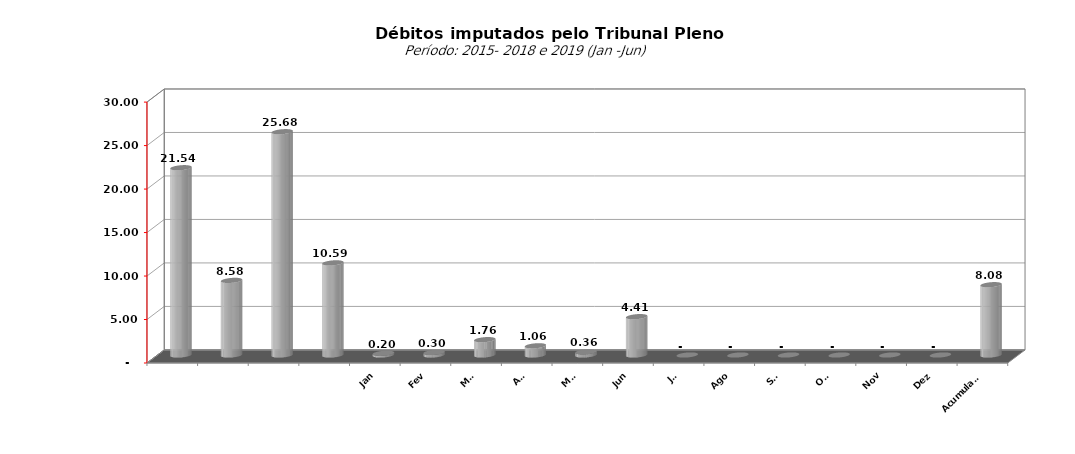
| Category |  7.073.154,74   5.749.129,25   4.727.033,51   16.081.820,48   21.535.723,60   8.578.266,09   25.676.499,17   10.592.915,18   197.255,77   296.375,09   1.764.671,00   1.058.511,33   358.973,08   4.409.150,19   -     -     -     -     -     -     8.084.936, |
|---|---|
|  | 21535723.6 |
|  | 8578266.09 |
|  | 25676499.17 |
|  | 10592915.18 |
| Jan | 197255.77 |
| Fev | 296375.09 |
| Mar | 1764671 |
| Abr | 1058511.33 |
| Mai | 358973.08 |
| Jun | 4409150.19 |
| Jul | 0 |
| Ago | 0 |
| Set | 0 |
| Out | 0 |
| Nov | 0 |
| Dez | 0 |
| Acumulado | 8084936.46 |